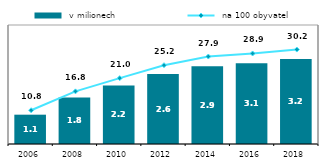
| Category |  v milionech |
|---|---|
| 2006.0 | 1.109 |
| 2008.0 | 1.76 |
| 2010.0 | 2.215 |
| 2012.0 | 2.645 |
| 2014.0 | 2.943 |
| 2016.0 | 3.058 |
| 2018.0 | 3.212 |